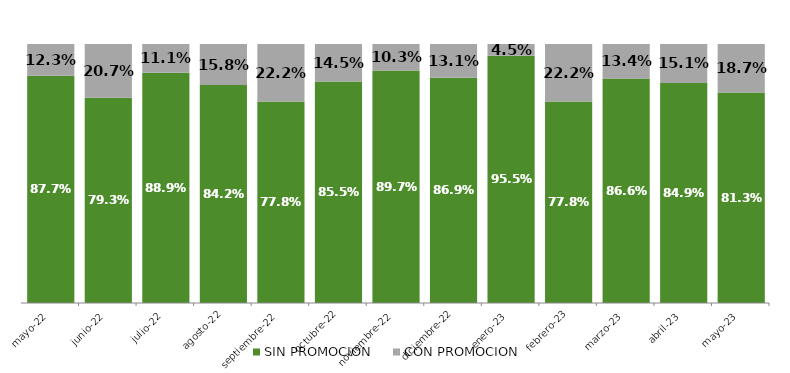
| Category | SIN PROMOCION   | CON PROMOCION   |
|---|---|---|
| 2022-05-01 | 0.877 | 0.123 |
| 2022-06-01 | 0.793 | 0.207 |
| 2022-07-01 | 0.889 | 0.111 |
| 2022-08-01 | 0.842 | 0.158 |
| 2022-09-01 | 0.778 | 0.222 |
| 2022-10-01 | 0.855 | 0.145 |
| 2022-11-01 | 0.897 | 0.103 |
| 2022-12-01 | 0.869 | 0.131 |
| 2023-01-01 | 0.955 | 0.045 |
| 2023-02-01 | 0.778 | 0.222 |
| 2023-03-01 | 0.866 | 0.134 |
| 2023-04-01 | 0.849 | 0.151 |
| 2023-05-01 | 0.813 | 0.187 |